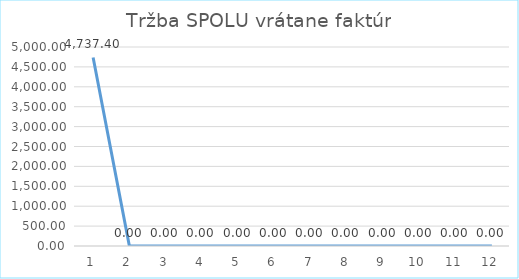
| Category | Series 0 |
|---|---|
| 0 | 4737.4 |
| 1 | 0 |
| 2 | 0 |
| 3 | 0 |
| 4 | 0 |
| 5 | 0 |
| 6 | 0 |
| 7 | 0 |
| 8 | 0 |
| 9 | 0 |
| 10 | 0 |
| 11 | 0 |